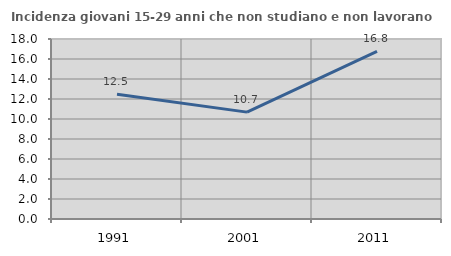
| Category | Incidenza giovani 15-29 anni che non studiano e non lavorano  |
|---|---|
| 1991.0 | 12.483 |
| 2001.0 | 10.687 |
| 2011.0 | 16.77 |